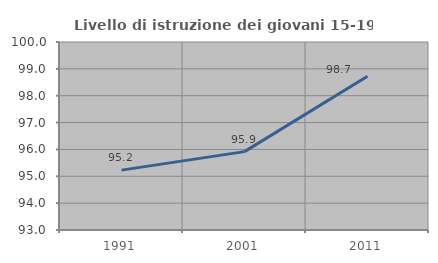
| Category | Livello di istruzione dei giovani 15-19 anni |
|---|---|
| 1991.0 | 95.23 |
| 2001.0 | 95.918 |
| 2011.0 | 98.721 |